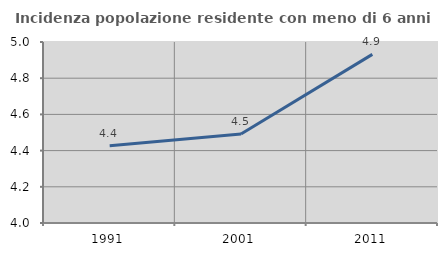
| Category | Incidenza popolazione residente con meno di 6 anni |
|---|---|
| 1991.0 | 4.426 |
| 2001.0 | 4.492 |
| 2011.0 | 4.932 |